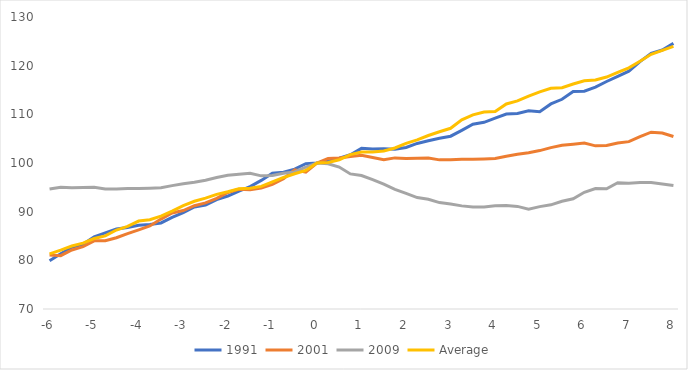
| Category | 1991 | 2001 | 2009 | Average |
|---|---|---|---|---|
| -6.0 | 79.914 | 81.101 | 94.657 | 81.328 |
| nan | 81.362 | 80.954 | 95.032 | 82.094 |
| nan | 82.66 | 82.119 | 94.899 | 82.934 |
| nan | 83.292 | 82.818 | 94.953 | 83.544 |
| -5.0 | 84.826 | 83.999 | 95.017 | 84.48 |
| nan | 85.651 | 84.026 | 94.652 | 85.011 |
| nan | 86.447 | 84.645 | 94.671 | 86.224 |
| nan | 86.734 | 85.496 | 94.785 | 86.966 |
| -4.0 | 87.193 | 86.268 | 94.76 | 88.066 |
| nan | 87.386 | 87.056 | 94.819 | 88.331 |
| nan | 87.687 | 88.479 | 94.923 | 89.095 |
| nan | 88.842 | 89.723 | 95.353 | 90.124 |
| -3.0 | 89.824 | 90.233 | 95.718 | 91.251 |
| nan | 90.957 | 91.23 | 96.029 | 92.131 |
| nan | 91.366 | 91.813 | 96.444 | 92.79 |
| nan | 92.463 | 92.737 | 97.022 | 93.552 |
| -2.0 | 93.209 | 93.94 | 97.476 | 94.088 |
| nan | 94.242 | 94.612 | 97.674 | 94.708 |
| nan | 95.152 | 94.481 | 97.906 | 94.822 |
| nan | 96.422 | 94.849 | 97.358 | 95.196 |
| -1.0 | 97.913 | 95.605 | 97.427 | 96.115 |
| nan | 98.093 | 96.776 | 97.906 | 97.028 |
| nan | 98.745 | 98.603 | 98.168 | 97.79 |
| nan | 99.849 | 98.146 | 99.151 | 98.46 |
| 0.0 | 100 | 100 | 100 | 100 |
| nan | 100.402 | 100.908 | 99.847 | 100.117 |
| nan | 100.99 | 101.045 | 99.16 | 100.678 |
| nan | 101.7 | 101.339 | 97.758 | 101.721 |
| 1.0 | 103.012 | 101.596 | 97.427 | 102.274 |
| nan | 102.861 | 101.15 | 96.587 | 102.247 |
| nan | 102.904 | 100.651 | 95.659 | 102.471 |
| nan | 102.825 | 101.05 | 94.597 | 103.087 |
| 2.0 | 103.184 | 100.908 | 93.753 | 104.028 |
| nan | 104.023 | 100.966 | 92.898 | 104.737 |
| nan | 104.568 | 101.035 | 92.538 | 105.653 |
| nan | 105.077 | 100.646 | 91.861 | 106.422 |
| 3.0 | 105.507 | 100.667 | 91.56 | 107.13 |
| nan | 106.712 | 100.788 | 91.19 | 108.868 |
| nan | 107.967 | 100.761 | 90.938 | 109.896 |
| nan | 108.361 | 100.824 | 90.982 | 110.488 |
| 4.0 | 109.208 | 100.935 | 91.205 | 110.594 |
| nan | 110.068 | 101.392 | 91.254 | 112.136 |
| nan | 110.176 | 101.78 | 91.086 | 112.767 |
| nan | 110.749 | 102.111 | 90.508 | 113.732 |
| 5.0 | 110.549 | 102.552 | 91.037 | 114.622 |
| nan | 112.141 | 103.167 | 91.402 | 115.355 |
| nan | 113.094 | 103.65 | 92.128 | 115.484 |
| nan | 114.708 | 103.86 | 92.661 | 116.229 |
| 6.0 | 114.744 | 104.106 | 93.98 | 116.879 |
| nan | 115.59 | 103.524 | 94.76 | 117.066 |
| nan | 116.752 | 103.597 | 94.696 | 117.657 |
| nan | 117.806 | 104.106 | 95.95 | 118.638 |
| 7.0 | 118.881 | 104.385 | 95.852 | 119.564 |
| nan | 120.825 | 105.43 | 95.995 | 120.923 |
| nan | 122.524 | 106.333 | 95.985 | 122.336 |
| nan | 123.22 | 106.17 | 95.694 | 123.138 |
| 8.0 | 124.582 | 105.44 | 95.378 | 123.976 |